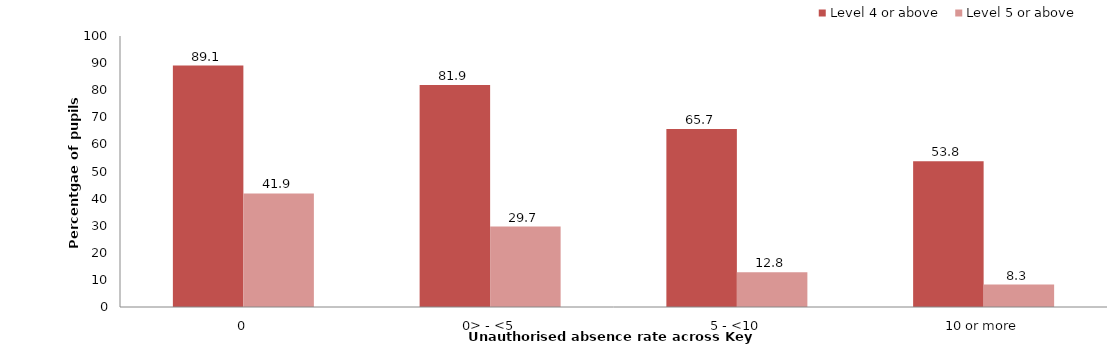
| Category | Level 4 or above | Level 5 or above |
|---|---|---|
| 0 | 89.1 | 41.9 |
| 0> - <5 | 81.9 | 29.7 |
| 5 - <10 | 65.7 | 12.8 |
| 10 or more | 53.8 | 8.3 |